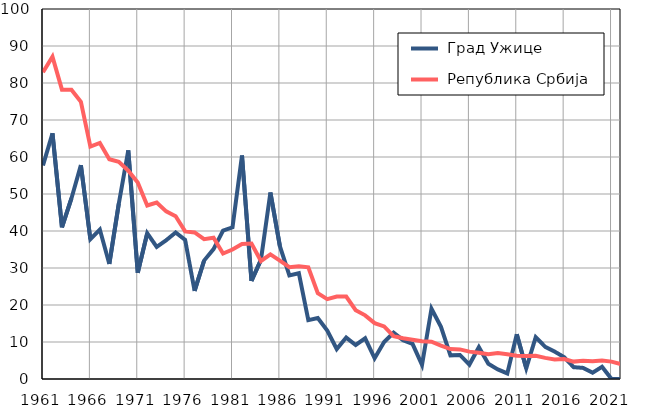
| Category |  Град Ужице |  Република Србија |
|---|---|---|
| 1961.0 | 57.7 | 82.9 |
| 1962.0 | 66.4 | 87.1 |
| 1963.0 | 41 | 78.2 |
| 1964.0 | 48.8 | 78.2 |
| 1965.0 | 57.8 | 74.9 |
| 1966.0 | 37.8 | 62.8 |
| 1967.0 | 40.4 | 63.8 |
| 1968.0 | 31.1 | 59.4 |
| 1969.0 | 47.4 | 58.7 |
| 1970.0 | 61.8 | 56.3 |
| 1971.0 | 28.7 | 53.1 |
| 1972.0 | 39.4 | 46.9 |
| 1973.0 | 35.7 | 47.7 |
| 1974.0 | 37.5 | 45.3 |
| 1975.0 | 39.6 | 44 |
| 1976.0 | 37.6 | 39.9 |
| 1977.0 | 23.8 | 39.6 |
| 1978.0 | 32 | 37.8 |
| 1979.0 | 35.1 | 38.2 |
| 1980.0 | 40.1 | 33.9 |
| 1981.0 | 41 | 35 |
| 1982.0 | 60.4 | 36.5 |
| 1983.0 | 26.5 | 36.6 |
| 1984.0 | 32.2 | 31.9 |
| 1985.0 | 50.4 | 33.7 |
| 1986.0 | 35.9 | 32 |
| 1987.0 | 28 | 30.2 |
| 1988.0 | 28.6 | 30.5 |
| 1989.0 | 15.9 | 30.2 |
| 1990.0 | 16.5 | 23.2 |
| 1991.0 | 13.1 | 21.6 |
| 1992.0 | 8.1 | 22.3 |
| 1993.0 | 11.2 | 22.3 |
| 1994.0 | 9.2 | 18.6 |
| 1995.0 | 11 | 17.2 |
| 1996.0 | 5.6 | 15.1 |
| 1997.0 | 10 | 14.2 |
| 1998.0 | 12.5 | 11.6 |
| 1999.0 | 10.5 | 11 |
| 2000.0 | 9.5 | 10.6 |
| 2001.0 | 3.8 | 10.2 |
| 2002.0 | 19 | 10.1 |
| 2003.0 | 14.1 | 9 |
| 2004.0 | 6.4 | 8.1 |
| 2005.0 | 6.5 | 8 |
| 2006.0 | 3.9 | 7.4 |
| 2007.0 | 8.6 | 7.1 |
| 2008.0 | 4.1 | 6.7 |
| 2009.0 | 2.6 | 7 |
| 2010.0 | 1.5 | 6.7 |
| 2011.0 | 12.1 | 6.3 |
| 2012.0 | 2.9 | 6.2 |
| 2013.0 | 11.3 | 6.3 |
| 2014.0 | 8.7 | 5.7 |
| 2015.0 | 7.4 | 5.3 |
| 2016.0 | 5.9 | 5.4 |
| 2017.0 | 3.2 | 4.7 |
| 2018.0 | 3 | 4.9 |
| 2019.0 | 1.7 | 4.8 |
| 2020.0 | 3.3 | 5 |
| 2021.0 | 0 | 4.7 |
| 2022.0 | 0 | 4 |